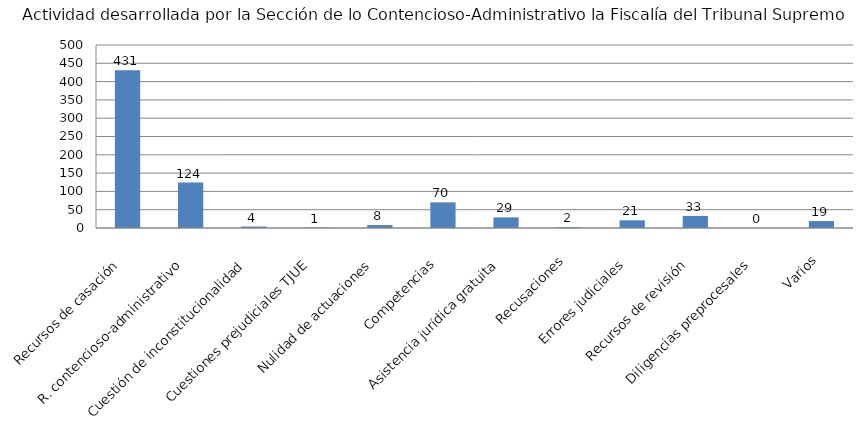
| Category | Series 0 |
|---|---|
| Recursos de casación  | 431 |
| R. contencioso-administrativo  | 124 |
| Cuestión de inconstitucionalidad  | 4 |
| Cuestiones prejudiciales TJUE  | 1 |
| Nulidad de actuaciones  | 8 |
| Competencias  | 70 |
| Asistencia jurídica gratuita  | 29 |
| Recusaciones  | 2 |
| Errores judiciales  | 21 |
| Recursos de revisión  | 33 |
| Diligencias preprocesales  | 0 |
| Varios | 19 |